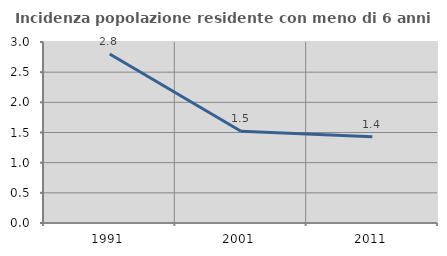
| Category | Incidenza popolazione residente con meno di 6 anni |
|---|---|
| 1991.0 | 2.8 |
| 2001.0 | 1.521 |
| 2011.0 | 1.429 |